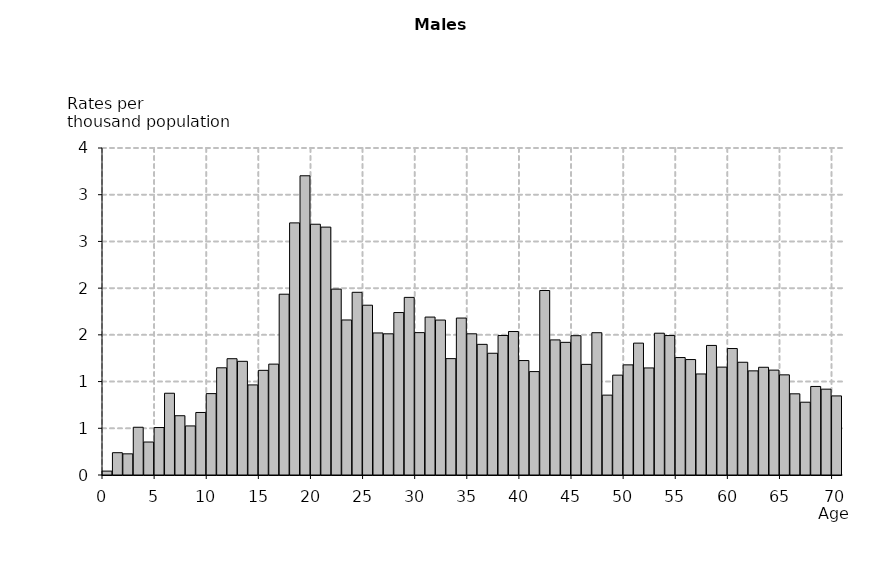
| Category | Series 0 |
|---|---|
| 0.0 | 0.042 |
| 1.0 | 0.239 |
| 2.0 | 0.226 |
| 3.0 | 0.511 |
| 4.0 | 0.353 |
| 5.0 | 0.508 |
| 6.0 | 0.875 |
| 7.0 | 0.634 |
| 8.0 | 0.525 |
| 9.0 | 0.669 |
| 10.0 | 0.871 |
| 11.0 | 1.147 |
| 12.0 | 1.245 |
| 13.0 | 1.217 |
| 14.0 | 0.964 |
| 15.0 | 1.12 |
| 16.0 | 1.187 |
| 17.0 | 1.935 |
| 18.0 | 2.698 |
| 19.0 | 3.203 |
| 20.0 | 2.684 |
| 21.0 | 2.653 |
| 22.0 | 1.99 |
| 23.0 | 1.659 |
| 24.0 | 1.956 |
| 25.0 | 1.817 |
| 26.0 | 1.52 |
| 27.0 | 1.511 |
| 28.0 | 1.739 |
| 29.0 | 1.901 |
| 30.0 | 1.524 |
| 31.0 | 1.69 |
| 32.0 | 1.658 |
| 33.0 | 1.246 |
| 34.0 | 1.68 |
| 35.0 | 1.511 |
| 36.0 | 1.398 |
| 37.0 | 1.303 |
| 38.0 | 1.493 |
| 39.0 | 1.536 |
| 40.0 | 1.225 |
| 41.0 | 1.107 |
| 42.0 | 1.975 |
| 43.0 | 1.446 |
| 44.0 | 1.42 |
| 45.0 | 1.491 |
| 46.0 | 1.184 |
| 47.0 | 1.523 |
| 48.0 | 0.855 |
| 49.0 | 1.069 |
| 50.0 | 1.179 |
| 51.0 | 1.411 |
| 52.0 | 1.146 |
| 53.0 | 1.518 |
| 54.0 | 1.492 |
| 55.0 | 1.257 |
| 56.0 | 1.236 |
| 57.0 | 1.082 |
| 58.0 | 1.387 |
| 59.0 | 1.155 |
| 60.0 | 1.354 |
| 61.0 | 1.207 |
| 62.0 | 1.115 |
| 63.0 | 1.153 |
| 64.0 | 1.123 |
| 65.0 | 1.072 |
| 66.0 | 0.869 |
| 67.0 | 0.779 |
| 68.0 | 0.948 |
| 69.0 | 0.919 |
| 70.0 | 0.846 |